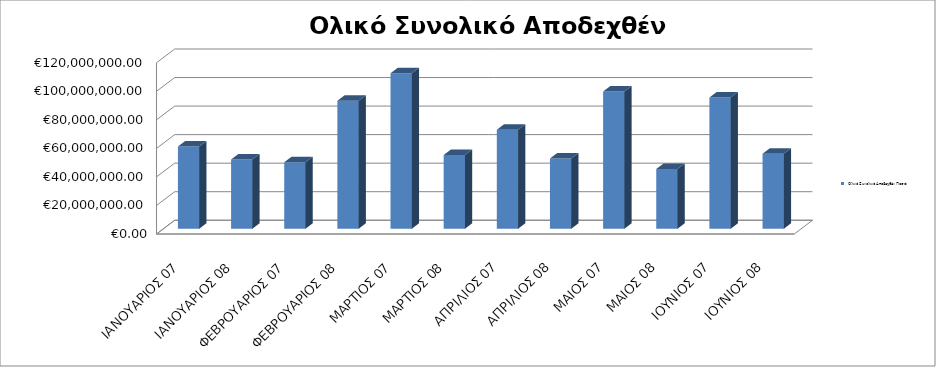
| Category | Ολικό Συνολικό Αποδεχθέν Ποσό: |
|---|---|
| ΙΑΝΟΥΑΡΙΟΣ 07 | 57707888.29 |
| ΙΑΝΟΥΑΡΙΟΣ 08 | 48530739.95 |
| ΦΕΒΡΟΥΑΡΙΟΣ 07 | 46655844.97 |
| ΦΕΒΡΟΥΑΡΙΟΣ 08 | 89725604.75 |
| ΜΑΡΤΙΟΣ 07 | 108952246.13 |
| ΜΑΡΤΙΟΣ 08 | 51722618.53 |
| ΑΠΡΙΛΙΟΣ 07 | 69404853.08 |
| ΑΠΡΙΛΙΟΣ 08 | 49270120.93 |
| ΜΑΙΟΣ 07 | 96185432.69 |
| ΜΑΙΟΣ 08 | 41864206.57 |
| ΙΟΥΝΙΟΣ 07 | 91945907.08 |
| ΙΟΥΝΙΟΣ 08 | 52606261.67 |